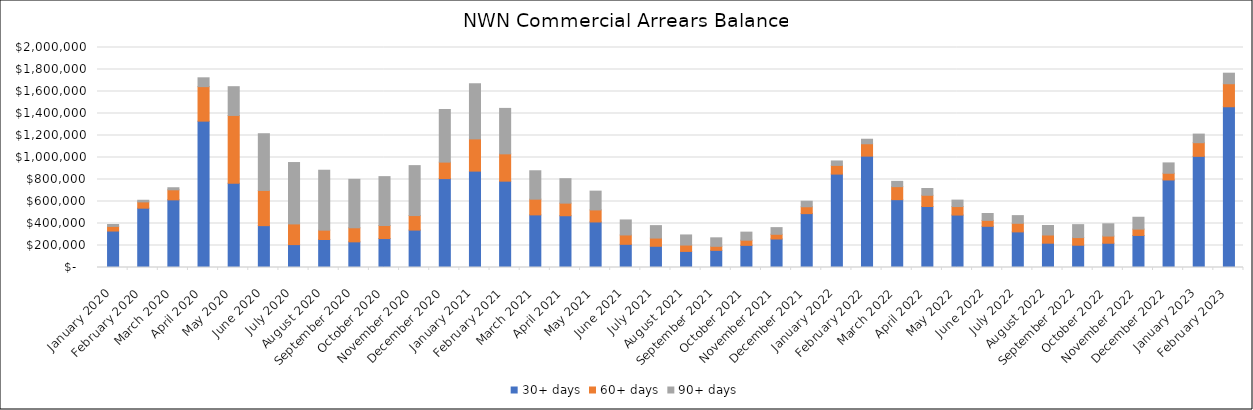
| Category | 30+ days | 60+ days | 90+ days |
|---|---|---|---|
| 2020-01-01 | 331382.41 | 42175.18 | 17287.25 |
| 2020-02-01 | 539256.79 | 57156.81 | 14759.27 |
| 2020-03-01 | 614911.1 | 91240.06 | 18866.08 |
| 2020-04-01 | 1330499.93 | 313690.26 | 80284.23 |
| 2020-05-01 | 766874.98 | 615444.62 | 261358.68 |
| 2020-06-01 | 380498.35 | 320150.45 | 515468 |
| 2020-07-01 | 208140.6 | 188033.58 | 558054.16 |
| 2020-08-01 | 254750.55 | 84889.32 | 544572.39 |
| 2020-09-01 | 233201.98 | 127844.16 | 440455.21 |
| 2020-10-01 | 263186 | 118563 | 444344 |
| 2020-11-01 | 340145 | 132091 | 453964 |
| 2020-12-01 | 808261 | 149833 | 478138 |
| 2021-01-01 | 876201 | 292884 | 501265 |
| 2021-02-01 | 784887 | 248293 | 413198 |
| 2021-03-01 | 478223 | 143008 | 258195 |
| 2021-04-01 | 470683 | 114409 | 222222 |
| 2021-05-01 | 413999.85 | 109613.3 | 170645.99 |
| 2021-06-01 | 210771.01 | 85004.88 | 136554.26 |
| 2021-07-01 | 192948 | 74696 | 113082 |
| 2021-08-01 | 146154.71 | 57887.81 | 91861.83 |
| 2021-09-01 | 155829 | 36861 | 77051 |
| 2021-10-01 | 201284.66 | 46898.36 | 73282.04 |
| 2021-11-01 | 259253.94 | 42716.54 | 60594.27 |
| 2021-12-01 | 489769.89 | 62354.16 | 50437.54 |
| 2022-01-01 | 849073.19 | 79012.97 | 40528.29 |
| 2022-02-01 | 1012538.35 | 112485.1 | 40995.09 |
| 2022-03-01 | 616623.67 | 118311.03 | 48112.21 |
| 2022-04-01 | 554419.63 | 102159.97 | 61682.16 |
| 2022-05-01 | 476669 | 77427 | 58542 |
| 2022-06-01 | 374564.48 | 53624.61 | 62943.91 |
| 2022-07-01 | 323674.3 | 78183.58 | 69727.89 |
| 2022-08-01 | 221008.35 | 74462.8 | 86583.91 |
| 2022-09-01 | 202539.23 | 69487.68 | 117617.24 |
| 2022-10-01 | 220485.39 | 65428.14 | 111346.88 |
| 2022-11-01 | 291472 | 57456.99 | 107829.57 |
| 2022-12-01 | 795674.79 | 60981.81 | 94248.91 |
| 2023-01-01 | 1010594.63 | 123853.31 | 78322.64 |
| 2023-02-01 | 1461301.03 | 209418.46 | 95691.43 |